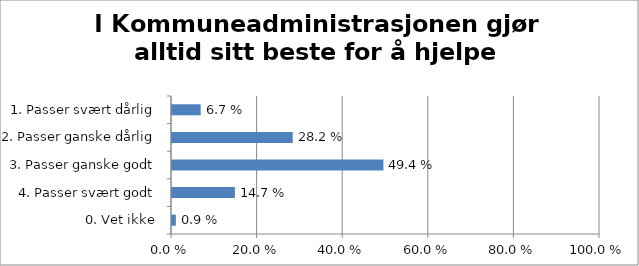
| Category | I Kommuneadministrasjonen gjør alltid sitt beste for å hjelpe innbyggerne. |
|---|---|
| 1. Passer svært dårlig | 0.067 |
| 2. Passer ganske dårlig | 0.282 |
| 3. Passer ganske godt | 0.494 |
| 4. Passer svært godt | 0.147 |
| 0. Vet ikke | 0.009 |